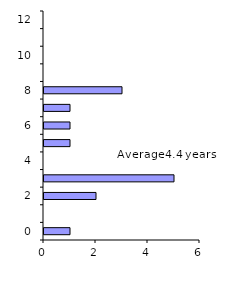
| Category | Series 0 |
|---|---|
| 0.0 | 1 |
| 1.0 | 0 |
| 2.0 | 2 |
| 3.0 | 5 |
| 4.0 | 0 |
| 5.0 | 1 |
| 6.0 | 1 |
| 7.0 | 1 |
| 8.0 | 3 |
| 9.0 | 0 |
| 10.0 | 0 |
| 11.0 | 0 |
| 12.0 | 0 |